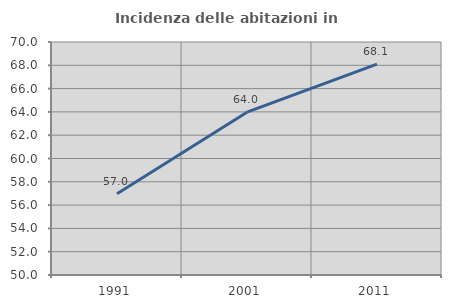
| Category | Incidenza delle abitazioni in proprietà  |
|---|---|
| 1991.0 | 56.976 |
| 2001.0 | 63.977 |
| 2011.0 | 68.107 |